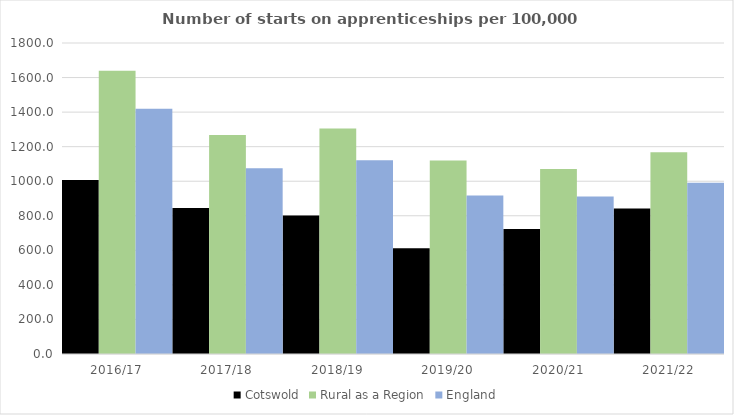
| Category | Cotswold | Rural as a Region | England |
|---|---|---|---|
| 2016/17 | 1007 | 1638.789 | 1420 |
| 2017/18 | 845 | 1267.474 | 1075 |
| 2018/19 | 801 | 1304.57 | 1122 |
| 2019/20 | 612 | 1119.662 | 918 |
| 2020/21 | 724 | 1070.748 | 912 |
| 2021/22 | 842 | 1167.68 | 991 |